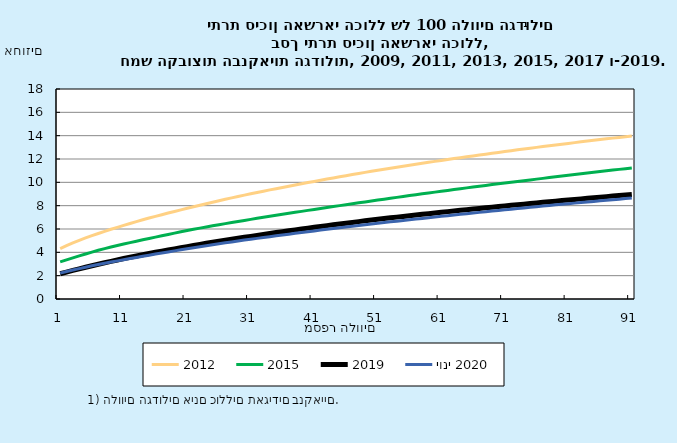
| Category | 2012 | 2015 | 2019 | יוני 2020 |
|---|---|---|---|---|
| 0 | 4.322 | 3.182 | 2.165 | 2.221 |
| 1 | 4.569 | 3.356 | 2.309 | 2.357 |
| 2 | 4.811 | 3.529 | 2.447 | 2.481 |
| 3 | 5.031 | 3.695 | 2.585 | 2.605 |
| 4 | 5.233 | 3.86 | 2.721 | 2.726 |
| 5 | 5.432 | 4.02 | 2.854 | 2.844 |
| 6 | 5.617 | 4.179 | 2.981 | 2.959 |
| 7 | 5.801 | 4.319 | 3.105 | 3.064 |
| 8 | 5.974 | 4.458 | 3.228 | 3.166 |
| 9 | 6.143 | 4.588 | 3.348 | 3.267 |
| 10 | 6.309 | 4.711 | 3.468 | 3.367 |
| 11 | 6.474 | 4.833 | 3.583 | 3.467 |
| 12 | 6.634 | 4.953 | 3.691 | 3.566 |
| 13 | 6.788 | 5.072 | 3.798 | 3.663 |
| 14 | 6.938 | 5.19 | 3.9 | 3.758 |
| 15 | 7.083 | 5.304 | 4.002 | 3.852 |
| 16 | 7.227 | 5.419 | 4.101 | 3.944 |
| 17 | 7.37 | 5.533 | 4.2 | 4.035 |
| 18 | 7.505 | 5.645 | 4.298 | 4.126 |
| 19 | 7.64 | 5.757 | 4.396 | 4.217 |
| 20 | 7.774 | 5.867 | 4.491 | 4.305 |
| 21 | 7.907 | 5.976 | 4.586 | 4.393 |
| 22 | 8.039 | 6.076 | 4.68 | 4.479 |
| 23 | 8.169 | 6.174 | 4.772 | 4.564 |
| 24 | 8.298 | 6.27 | 4.862 | 4.649 |
| 25 | 8.424 | 6.367 | 4.949 | 4.732 |
| 26 | 8.549 | 6.46 | 5.034 | 4.813 |
| 27 | 8.668 | 6.553 | 5.119 | 4.894 |
| 28 | 8.786 | 6.645 | 5.203 | 4.974 |
| 29 | 8.904 | 6.736 | 5.286 | 5.049 |
| 30 | 9.02 | 6.826 | 5.37 | 5.122 |
| 31 | 9.135 | 6.916 | 5.453 | 5.196 |
| 32 | 9.244 | 7.002 | 5.533 | 5.269 |
| 33 | 9.352 | 7.087 | 5.613 | 5.341 |
| 34 | 9.458 | 7.173 | 5.692 | 5.414 |
| 35 | 9.563 | 7.257 | 5.77 | 5.485 |
| 36 | 9.668 | 7.342 | 5.849 | 5.557 |
| 37 | 9.773 | 7.427 | 5.926 | 5.627 |
| 38 | 9.877 | 7.511 | 6 | 5.697 |
| 39 | 9.98 | 7.595 | 6.074 | 5.766 |
| 40 | 10.08 | 7.678 | 6.148 | 5.836 |
| 41 | 10.179 | 7.761 | 6.219 | 5.905 |
| 42 | 10.278 | 7.843 | 6.29 | 5.973 |
| 43 | 10.377 | 7.923 | 6.359 | 6.041 |
| 44 | 10.475 | 8.003 | 6.429 | 6.107 |
| 45 | 10.572 | 8.083 | 6.498 | 6.173 |
| 46 | 10.669 | 8.162 | 6.566 | 6.238 |
| 47 | 10.762 | 8.242 | 6.633 | 6.303 |
| 48 | 10.855 | 8.32 | 6.7 | 6.366 |
| 49 | 10.947 | 8.399 | 6.765 | 6.43 |
| 50 | 11.037 | 8.477 | 6.829 | 6.491 |
| 51 | 11.124 | 8.555 | 6.893 | 6.552 |
| 52 | 11.212 | 8.632 | 6.956 | 6.612 |
| 53 | 11.299 | 8.71 | 7.018 | 6.672 |
| 54 | 11.385 | 8.786 | 7.078 | 6.732 |
| 55 | 11.471 | 8.862 | 7.138 | 6.792 |
| 56 | 11.554 | 8.937 | 7.198 | 6.851 |
| 57 | 11.636 | 9.012 | 7.257 | 6.91 |
| 58 | 11.717 | 9.087 | 7.316 | 6.968 |
| 59 | 11.797 | 9.161 | 7.374 | 7.027 |
| 60 | 11.877 | 9.235 | 7.432 | 7.084 |
| 61 | 11.956 | 9.309 | 7.488 | 7.142 |
| 62 | 12.034 | 9.382 | 7.544 | 7.199 |
| 63 | 12.111 | 9.454 | 7.599 | 7.256 |
| 64 | 12.187 | 9.525 | 7.654 | 7.312 |
| 65 | 12.263 | 9.595 | 7.708 | 7.369 |
| 66 | 12.339 | 9.666 | 7.763 | 7.425 |
| 67 | 12.414 | 9.736 | 7.816 | 7.481 |
| 68 | 12.489 | 9.805 | 7.87 | 7.537 |
| 69 | 12.564 | 9.873 | 7.923 | 7.592 |
| 70 | 12.638 | 9.941 | 7.976 | 7.648 |
| 71 | 12.712 | 10.009 | 8.028 | 7.702 |
| 72 | 12.783 | 10.076 | 8.079 | 7.756 |
| 73 | 12.855 | 10.142 | 8.131 | 7.809 |
| 74 | 12.925 | 10.208 | 8.182 | 7.863 |
| 75 | 12.996 | 10.274 | 8.232 | 7.915 |
| 76 | 13.066 | 10.34 | 8.283 | 7.967 |
| 77 | 13.135 | 10.406 | 8.334 | 8.018 |
| 78 | 13.203 | 10.471 | 8.385 | 8.068 |
| 79 | 13.27 | 10.535 | 8.434 | 8.118 |
| 80 | 13.337 | 10.6 | 8.484 | 8.168 |
| 81 | 13.403 | 10.665 | 8.533 | 8.218 |
| 82 | 13.469 | 10.729 | 8.582 | 8.267 |
| 83 | 13.534 | 10.793 | 8.631 | 8.316 |
| 84 | 13.599 | 10.858 | 8.679 | 8.365 |
| 85 | 13.663 | 10.922 | 8.727 | 8.414 |
| 86 | 13.726 | 10.985 | 8.775 | 8.462 |
| 87 | 13.789 | 11.048 | 8.822 | 8.51 |
| 88 | 13.851 | 11.11 | 8.87 | 8.559 |
| 89 | 13.914 | 11.173 | 8.916 | 8.607 |
| 90 | 13.976 | 11.235 | 8.963 | 8.654 |